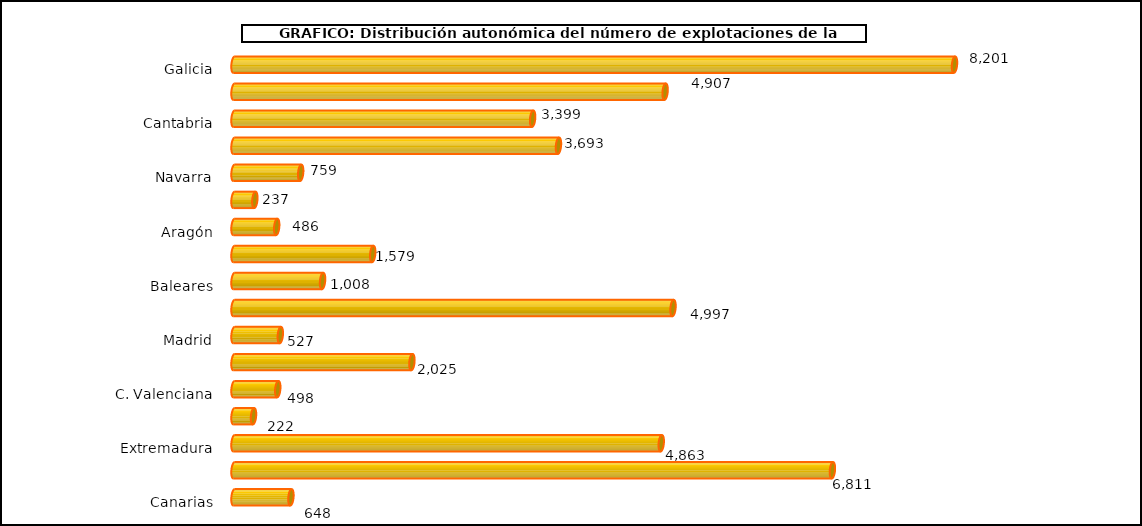
| Category | num. Explotaciones |
|---|---|
|   Galicia | 8201 |
|   P. de Asturias | 4907 |
|   Cantabria | 3399 |
|   País Vasco | 3693 |
|   Navarra | 759 |
|   La Rioja | 237 |
|   Aragón | 486 |
|   Cataluña | 1579 |
|   Baleares | 1008 |
|   Castilla y León | 4997 |
|   Madrid | 527 |
|   Castilla – La Mancha | 2025 |
|   C. Valenciana | 498 |
|   R. de Murcia | 222 |
|   Extremadura | 4863 |
|   Andalucía | 6811 |
|   Canarias | 648 |